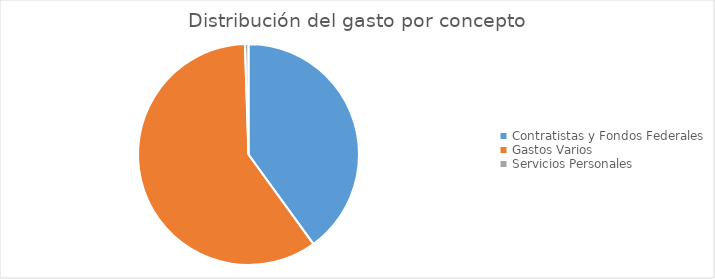
| Category | Series 0 |
|---|---|
| Contratistas y Fondos Federales | 115507069.42 |
| Gastos Varios | 171658972.18 |
| Servicios Personales | 1503755.65 |